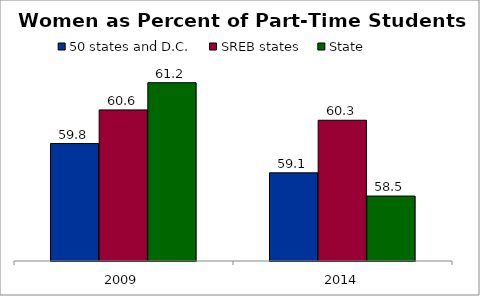
| Category | 50 states and D.C. | SREB states | State |
|---|---|---|---|
| 2009 | 59.767 | 60.559 | 61.201 |
| 2014 | 59.077 | 60.316 | 58.53 |